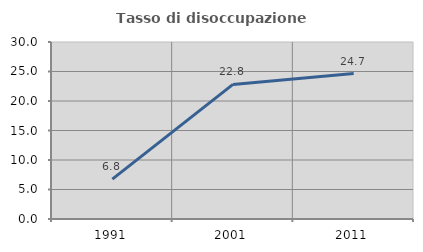
| Category | Tasso di disoccupazione giovanile  |
|---|---|
| 1991.0 | 6.757 |
| 2001.0 | 22.807 |
| 2011.0 | 24.658 |